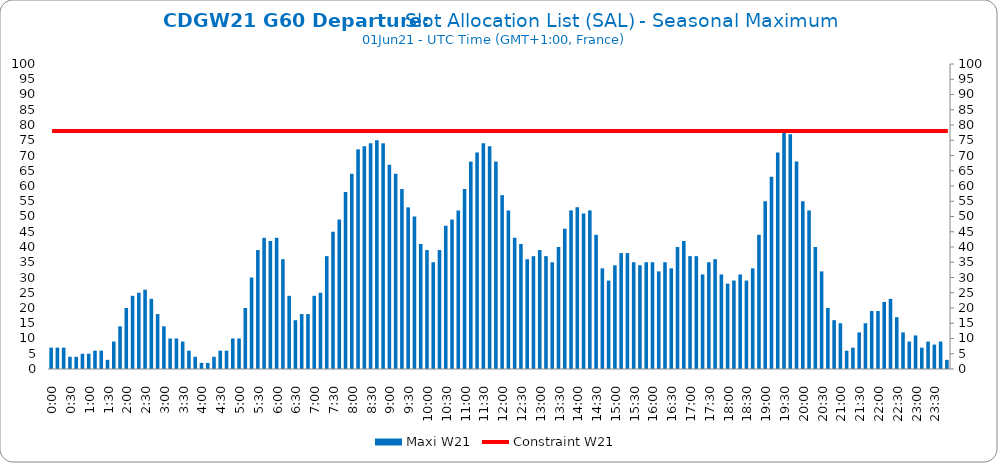
| Category | Maxi W21 |
|---|---|
| 0.0 | 7 |
| 0.006944444444444444 | 7 |
| 0.013888888888888888 | 7 |
| 0.020833333333333332 | 4 |
| 0.027777777777777776 | 4 |
| 0.034722222222222224 | 5 |
| 0.041666666666666664 | 5 |
| 0.04861111111111111 | 6 |
| 0.05555555555555555 | 6 |
| 0.0625 | 3 |
| 0.06944444444444443 | 9 |
| 0.0763888888888889 | 14 |
| 0.08333333333333333 | 20 |
| 0.09027777777777778 | 24 |
| 0.09722222222222222 | 25 |
| 0.10416666666666667 | 26 |
| 0.1111111111111111 | 23 |
| 0.11805555555555557 | 18 |
| 0.125 | 14 |
| 0.13194444444444445 | 10 |
| 0.1388888888888889 | 10 |
| 0.14583333333333334 | 9 |
| 0.15277777777777776 | 6 |
| 0.15972222222222224 | 4 |
| 0.16666666666666666 | 2 |
| 0.17361111111111113 | 2 |
| 0.18055555555555555 | 4 |
| 0.1875 | 6 |
| 0.19444444444444445 | 6 |
| 0.20138888888888887 | 10 |
| 0.20833333333333334 | 10 |
| 0.2152777777777778 | 20 |
| 0.2222222222222222 | 30 |
| 0.22916666666666666 | 39 |
| 0.23611111111111113 | 43 |
| 0.24305555555555555 | 42 |
| 0.25 | 43 |
| 0.2569444444444445 | 36 |
| 0.2638888888888889 | 24 |
| 0.2708333333333333 | 16 |
| 0.2777777777777778 | 18 |
| 0.2847222222222222 | 18 |
| 0.2916666666666667 | 24 |
| 0.2986111111111111 | 25 |
| 0.3055555555555555 | 37 |
| 0.3125 | 45 |
| 0.3194444444444445 | 49 |
| 0.3263888888888889 | 58 |
| 0.3333333333333333 | 64 |
| 0.34027777777777773 | 72 |
| 0.34722222222222227 | 73 |
| 0.3541666666666667 | 74 |
| 0.3611111111111111 | 75 |
| 0.3680555555555556 | 74 |
| 0.375 | 67 |
| 0.3819444444444444 | 64 |
| 0.3888888888888889 | 59 |
| 0.3958333333333333 | 53 |
| 0.40277777777777773 | 50 |
| 0.40972222222222227 | 41 |
| 0.4166666666666667 | 39 |
| 0.4236111111111111 | 35 |
| 0.4305555555555556 | 39 |
| 0.4375 | 47 |
| 0.4444444444444444 | 49 |
| 0.4513888888888889 | 52 |
| 0.4583333333333333 | 59 |
| 0.46527777777777773 | 68 |
| 0.47222222222222227 | 71 |
| 0.4791666666666667 | 74 |
| 0.4861111111111111 | 73 |
| 0.4930555555555556 | 68 |
| 0.5 | 57 |
| 0.5069444444444444 | 52 |
| 0.513888888888889 | 43 |
| 0.5208333333333334 | 41 |
| 0.5277777777777778 | 36 |
| 0.5347222222222222 | 37 |
| 0.5416666666666666 | 39 |
| 0.548611111111111 | 37 |
| 0.5555555555555556 | 35 |
| 0.5625 | 40 |
| 0.5694444444444444 | 46 |
| 0.576388888888889 | 52 |
| 0.5833333333333334 | 53 |
| 0.5902777777777778 | 51 |
| 0.5972222222222222 | 52 |
| 0.6041666666666666 | 44 |
| 0.611111111111111 | 33 |
| 0.6180555555555556 | 29 |
| 0.625 | 34 |
| 0.6319444444444444 | 38 |
| 0.638888888888889 | 38 |
| 0.6458333333333334 | 35 |
| 0.6527777777777778 | 34 |
| 0.6597222222222222 | 35 |
| 0.6666666666666666 | 35 |
| 0.6736111111111112 | 32 |
| 0.6805555555555555 | 35 |
| 0.6875 | 33 |
| 0.6944444444444445 | 40 |
| 0.7013888888888888 | 42 |
| 0.7083333333333334 | 37 |
| 0.7152777777777778 | 37 |
| 0.7222222222222222 | 31 |
| 0.7291666666666666 | 35 |
| 0.7361111111111112 | 36 |
| 0.7430555555555555 | 31 |
| 0.75 | 28 |
| 0.7569444444444445 | 29 |
| 0.7638888888888888 | 31 |
| 0.7708333333333334 | 29 |
| 0.7777777777777778 | 33 |
| 0.7847222222222222 | 44 |
| 0.7916666666666666 | 55 |
| 0.7986111111111112 | 63 |
| 0.8055555555555555 | 71 |
| 0.8125 | 78 |
| 0.8194444444444445 | 77 |
| 0.8263888888888888 | 68 |
| 0.8333333333333334 | 55 |
| 0.8402777777777778 | 52 |
| 0.8472222222222222 | 40 |
| 0.8541666666666666 | 32 |
| 0.8611111111111112 | 20 |
| 0.8680555555555555 | 16 |
| 0.875 | 15 |
| 0.8819444444444445 | 6 |
| 0.8888888888888888 | 7 |
| 0.8958333333333334 | 12 |
| 0.9027777777777778 | 15 |
| 0.9097222222222222 | 19 |
| 0.9166666666666666 | 19 |
| 0.9236111111111112 | 22 |
| 0.9305555555555555 | 23 |
| 0.9375 | 17 |
| 0.9444444444444445 | 12 |
| 0.9513888888888888 | 9 |
| 0.9583333333333334 | 11 |
| 0.9652777777777778 | 7 |
| 0.9722222222222222 | 9 |
| 0.9791666666666666 | 8 |
| 0.9861111111111112 | 9 |
| 0.9930555555555555 | 3 |